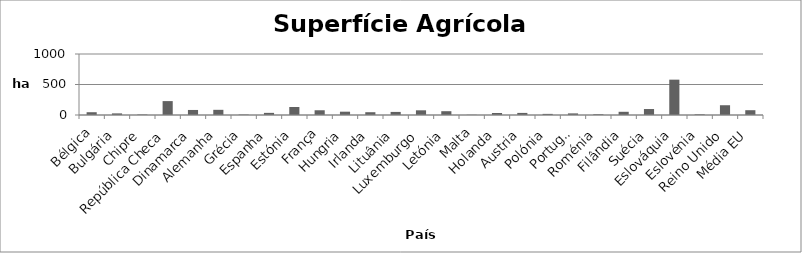
| Category | Series 0 |
|---|---|
| Bélgica | 45.52 |
| Bulgária | 26.41 |
| Chipre | 7.97 |
| República Checa | 227.88 |
| Dinamarca | 82.57 |
| Alemanha | 84.81 |
| Grécia | 7.09 |
| Espanha | 35.03 |
| Estónia | 131.16 |
| França | 77.77 |
| Hungria | 54.34 |
| Irlanda | 45.7 |
| Lituânia | 50.49 |
| Luxemburgo | 76.86 |
| Letónia | 62.3 |
| Malta | 3.62 |
| Holanda | 32.54 |
| Austria | 34.22 |
| Polónia | 18.29 |
| Portugal | 26.42 |
| Roménia | 12.52 |
| Filândia | 52.61 |
| Suécia | 97.87 |
| Eslováquia | 579.35 |
| Eslovénia | 11.04 |
| Reino Unido | 160.19 |
| Média EU | 78.637 |